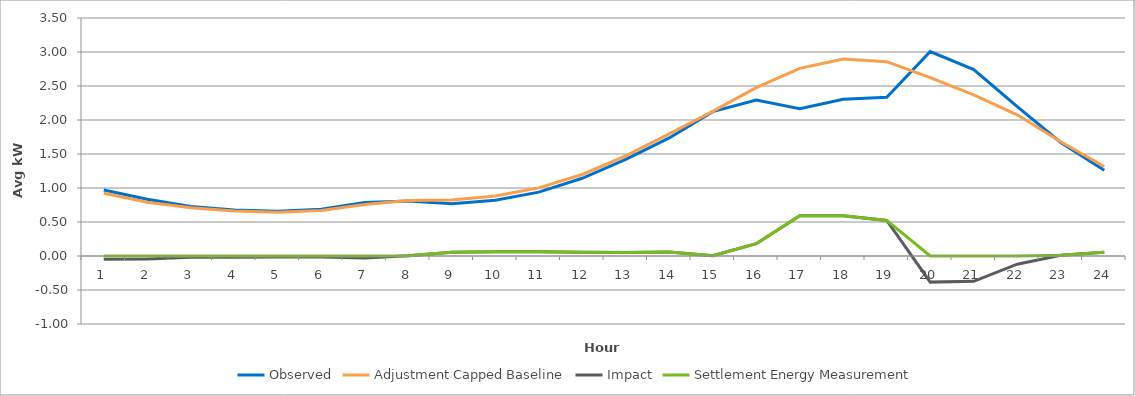
| Category | Observed | Adjustment Capped Baseline | Impact | Settlement Energy Measurement |
|---|---|---|---|---|
| 0 | 0.971 | 0.923 | -0.049 | 0 |
| 1 | 0.833 | 0.791 | -0.043 | 0 |
| 2 | 0.73 | 0.711 | -0.019 | 0 |
| 3 | 0.678 | 0.66 | -0.018 | 0 |
| 4 | 0.657 | 0.643 | -0.013 | 0 |
| 5 | 0.686 | 0.67 | -0.016 | 0 |
| 6 | 0.788 | 0.759 | -0.029 | 0 |
| 7 | 0.811 | 0.816 | 0.005 | 0.005 |
| 8 | 0.77 | 0.824 | 0.054 | 0.054 |
| 9 | 0.82 | 0.883 | 0.063 | 0.063 |
| 10 | 0.939 | 1.002 | 0.062 | 0.062 |
| 11 | 1.143 | 1.199 | 0.055 | 0.055 |
| 12 | 1.422 | 1.474 | 0.051 | 0.051 |
| 13 | 1.736 | 1.796 | 0.059 | 0.059 |
| 14 | 2.124 | 2.127 | 0.003 | 0.003 |
| 15 | 2.294 | 2.476 | 0.181 | 0.181 |
| 16 | 2.166 | 2.759 | 0.593 | 0.593 |
| 17 | 2.306 | 2.898 | 0.591 | 0.591 |
| 18 | 2.334 | 2.857 | 0.523 | 0.523 |
| 19 | 3.006 | 2.622 | -0.384 | 0 |
| 20 | 2.742 | 2.37 | -0.372 | 0 |
| 21 | 2.197 | 2.076 | -0.121 | 0 |
| 22 | 1.67 | 1.681 | 0.01 | 0.01 |
| 23 | 1.263 | 1.317 | 0.054 | 0.054 |